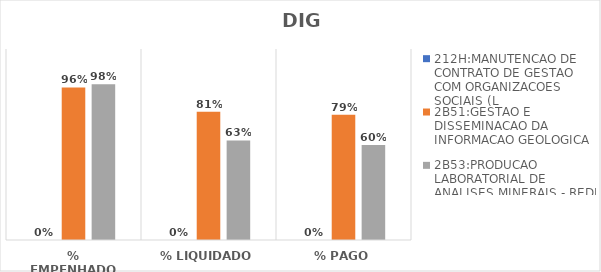
| Category | 212H:MANUTENCAO DE CONTRATO DE GESTAO COM ORGANIZACOES SOCIAIS (L | 2B51:GESTAO E DISSEMINACAO DA INFORMACAO GEOLOGICA | 2B53:PRODUCAO LABORATORIAL DE ANALISES MINERAIS - REDE LAMIN |
|---|---|---|---|
| % EMPENHADO | 0 | 0.959 | 0.979 |
| % LIQUIDADO | 0 | 0.806 | 0.626 |
| % PAGO | 0 | 0.787 | 0.597 |